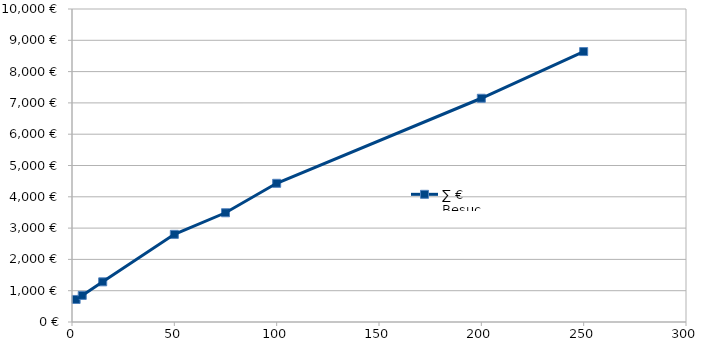
| Category | ∑ € Besuchsaudit |
|---|---|
| 2.0 | 720 |
| 5.0 | 850 |
| 15.0 | 1283.333 |
| 50.0 | 2800 |
| 75.0 | 3490 |
| 100.0 | 4431.129 |
| 200.0 | 7148.333 |
| 250.0 | 8640 |